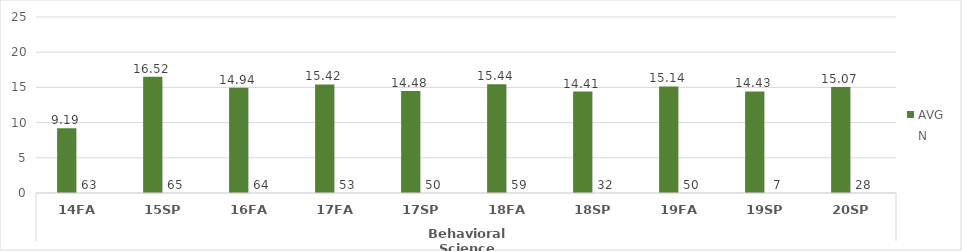
| Category | Written Communication - AVG | Written Communication - N |
|---|---|---|
| 0 | 9.19 | 63 |
| 1 | 16.523 | 65 |
| 2 | 14.938 | 64 |
| 3 | 15.415 | 53 |
| 4 | 14.48 | 50 |
| 5 | 15.441 | 59 |
| 6 | 14.406 | 32 |
| 7 | 15.14 | 50 |
| 8 | 14.429 | 7 |
| 9 | 15.071 | 28 |